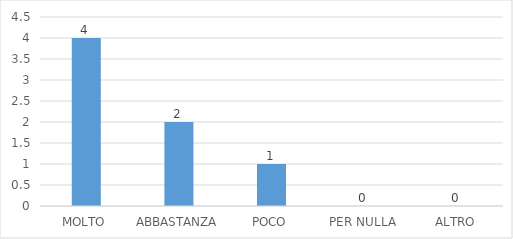
| Category | Series 0 |
|---|---|
| MOLTO | 4 |
| ABBASTANZA | 2 |
| POCO | 1 |
| PER NULLA | 0 |
| ALTRO | 0 |